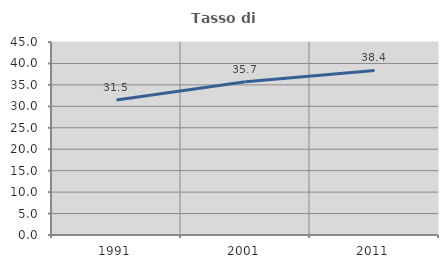
| Category | Tasso di occupazione   |
|---|---|
| 1991.0 | 31.481 |
| 2001.0 | 35.718 |
| 2011.0 | 38.364 |